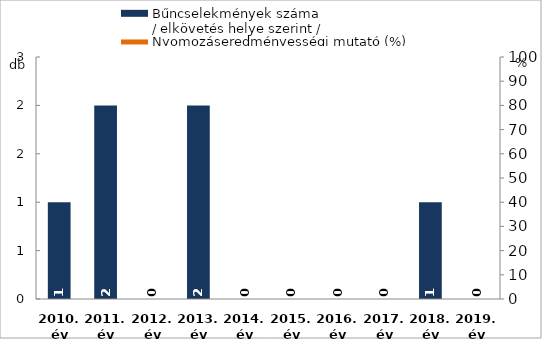
| Category | Bűncselekmények száma
/ elkövetés helye szerint / |
|---|---|
| 2010. év | 1 |
| 2011. év | 2 |
| 2012. év | 0 |
| 2013. év | 2 |
| 2014. év | 0 |
| 2015. év | 0 |
| 2016. év | 0 |
| 2017. év | 0 |
| 2018. év | 1 |
| 2019. év | 0 |